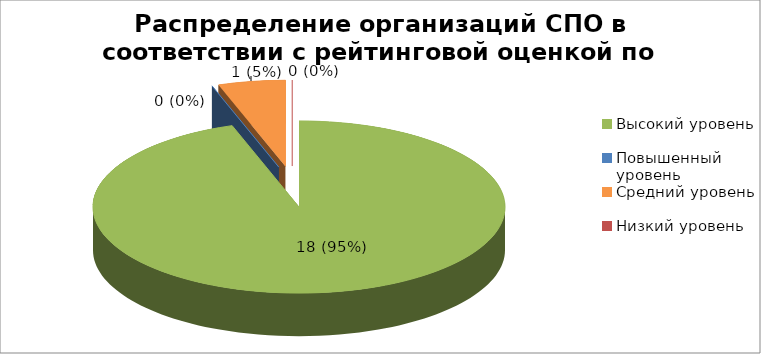
| Category | Series 8 | Series 9 |
|---|---|---|
| Высокий уровень | 0.947 |  |
| Повышенный уровень | 0 |  |
| Средний уровень | 0.053 |  |
| Низкий уровень | 0 |  |